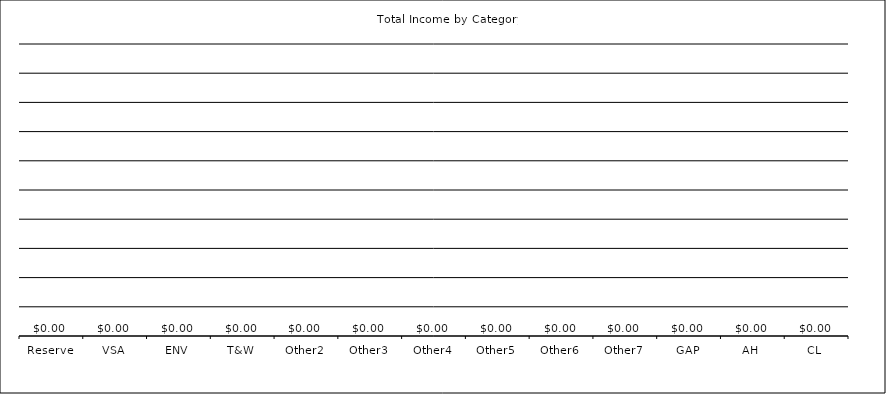
| Category | Income |
|---|---|
| Reserve | 0 |
| VSA | 0 |
| ENV | 0 |
| T&W | 0 |
| Other2 | 0 |
| Other3 | 0 |
| Other4 | 0 |
| Other5 | 0 |
| Other6 | 0 |
| Other7 | 0 |
| GAP | 0 |
| AH | 0 |
| CL | 0 |